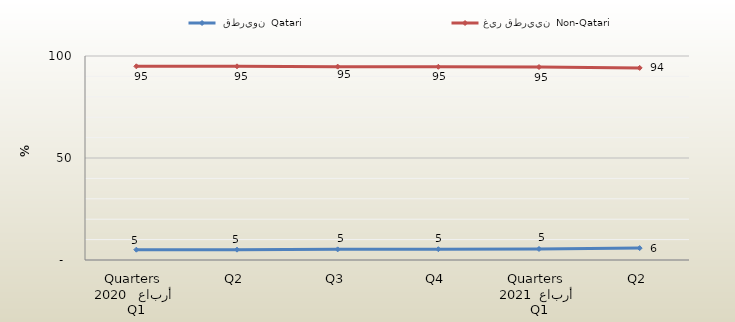
| Category |  قطريون  Qatari | غير قطريين  Non-Qatari |
|---|---|---|
| 0 | 5.057 | 94.943 |
| 1 | 5.067 | 94.933 |
| 2 | 5.214 | 94.786 |
| 3 | 5.293 | 94.707 |
| 4 | 5.404 | 94.596 |
| 5 | 5.836 | 94.164 |